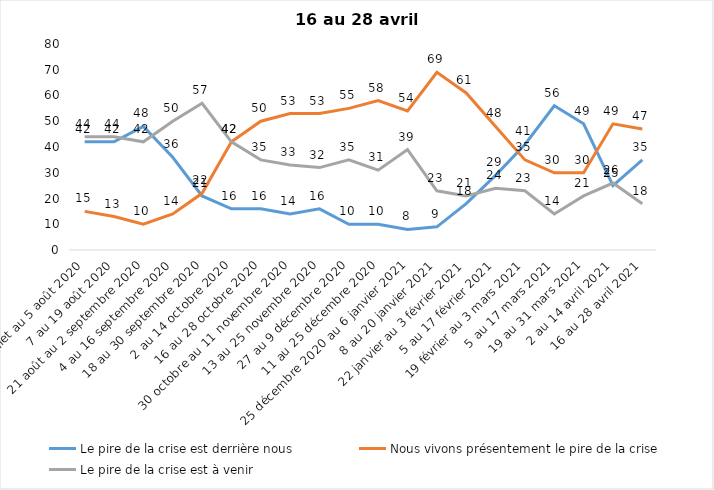
| Category | Le pire de la crise est derrière nous | Nous vivons présentement le pire de la crise | Le pire de la crise est à venir |
|---|---|---|---|
| 24 juillet au 5 août 2020 | 42 | 15 | 44 |
| 7 au 19 août 2020 | 42 | 13 | 44 |
| 21 août au 2 septembre 2020 | 48 | 10 | 42 |
| 4 au 16 septembre 2020 | 36 | 14 | 50 |
| 18 au 30 septembre 2020 | 21 | 22 | 57 |
| 2 au 14 octobre 2020 | 16 | 42 | 42 |
| 16 au 28 octobre 2020 | 16 | 50 | 35 |
| 30 octobre au 11 novembre 2020 | 14 | 53 | 33 |
| 13 au 25 novembre 2020 | 16 | 53 | 32 |
| 27 au 9 décembre 2020 | 10 | 55 | 35 |
| 11 au 25 décembre 2020 | 10 | 58 | 31 |
| 25 décembre 2020 au 6 janvier 2021 | 8 | 54 | 39 |
| 8 au 20 janvier 2021 | 9 | 69 | 23 |
| 22 janvier au 3 février 2021 | 18 | 61 | 21 |
| 5 au 17 février 2021 | 29 | 48 | 24 |
| 19 février au 3 mars 2021 | 41 | 35 | 23 |
| 5 au 17 mars 2021 | 56 | 30 | 14 |
| 19 au 31 mars 2021 | 49 | 30 | 21 |
| 2 au 14 avril 2021 | 25 | 49 | 26 |
| 16 au 28 avril 2021 | 35 | 47 | 18 |